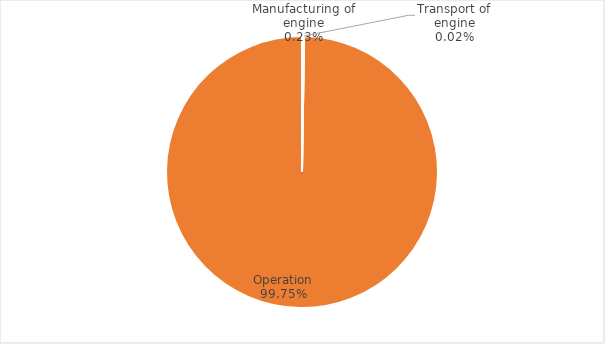
| Category | Series 0 |
|---|---|
| Manufacturing of engine | 2704.775 |
| Transport of engine | 227.146 |
| Operation | 1177742.222 |